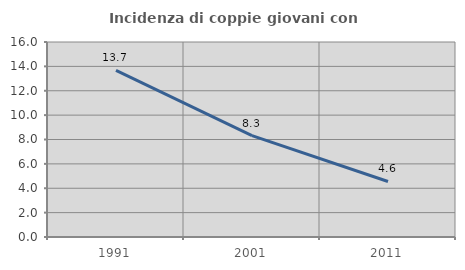
| Category | Incidenza di coppie giovani con figli |
|---|---|
| 1991.0 | 13.672 |
| 2001.0 | 8.312 |
| 2011.0 | 4.557 |